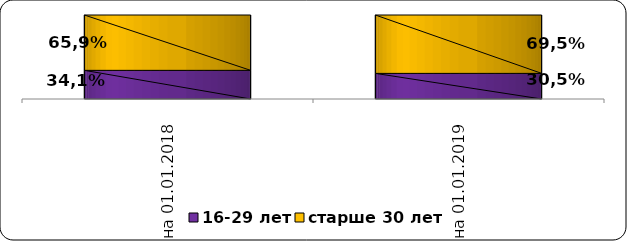
| Category | 16-29 лет | старше 30 лет |
|---|---|---|
| на 01.01.2018  | 0.341 | 0.659 |
| на 01.01.2019  | 0.305 | 0.695 |